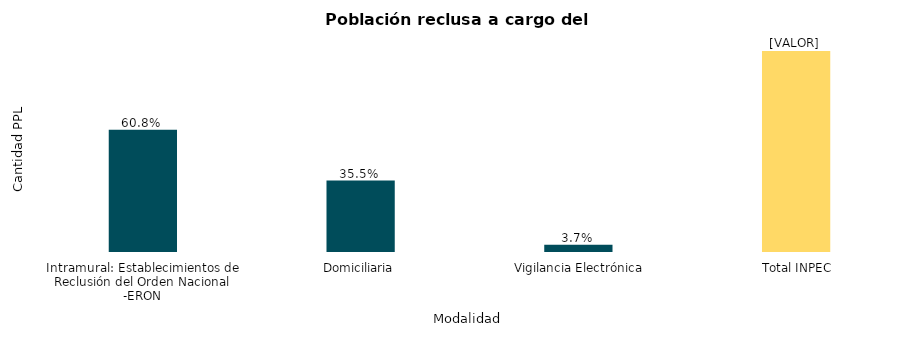
| Category | Total PPL |
|---|---|
| Intramural: Establecimientos de Reclusión del Orden Nacional -ERON | 102414 |
| Domiciliaria | 59814 |
|  Vigilancia Electrónica | 6154 |
|  Total INPEC | 168382 |